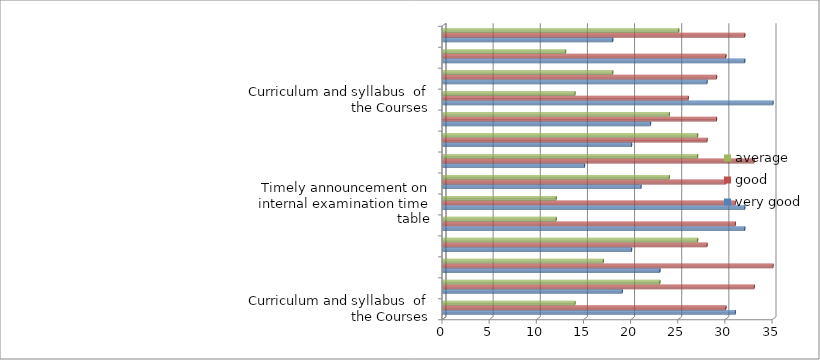
| Category | very good | good | average |
|---|---|---|---|
| Curriculum and syllabus  of the Courses | 31 | 30 | 14 |
| Extent of syllabus covered in the class | 19 | 33 | 23 |
| Courses delivery by faculty members in the class | 23 | 35 | 17 |
| Usage of teaching aids and ICT in the class | 20 | 28 | 27 |
| Fairness in the assessment Process | 32 | 31 | 12 |
| Timely announcement on internal examination time table | 32 | 31 | 12 |
| Opportunities available in the college for best practices/ other activities | 21 | 30 | 24 |
| Opportunities available in the college for students to participate in internship, field visits etc. | 15 | 33 | 27 |
| Opportunities for out of class room learning eg. Guest lectures, Seminars, Workshop Value aided Programmes, Conferences, competitions etc. | 20 | 28 | 27 |
| Overall Learning Experience | 22 | 29 | 24 |
| Curriculum and syllabus  of the Courses | 35 | 26 | 14 |
| Extent of syllabus covered in the class | 28 | 29 | 18 |
| Courses delivery by faculty members in the class | 32 | 30 | 13 |
| Usage of teaching aids and ICT in the class | 18 | 32 | 25 |